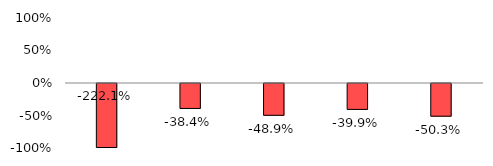
| Category | Series 1 |
|---|---|
| Profit/Loss | -2.221 |
| Income | -0.384 |
| Expenditure (Excl. Admin) | -0.489 |
| Personal Exp | -0.399 |
| Other Exp | -0.503 |